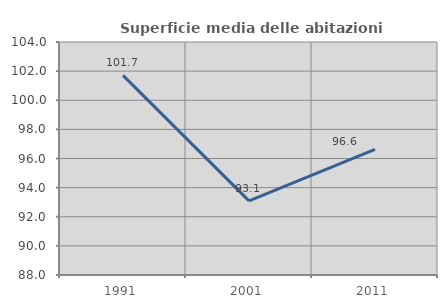
| Category | Superficie media delle abitazioni occupate |
|---|---|
| 1991.0 | 101.709 |
| 2001.0 | 93.093 |
| 2011.0 | 96.625 |